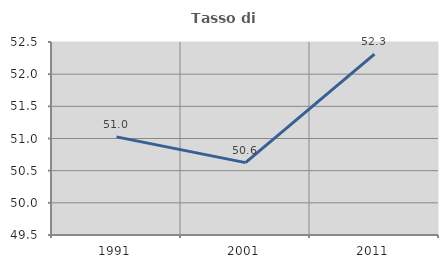
| Category | Tasso di occupazione   |
|---|---|
| 1991.0 | 51.025 |
| 2001.0 | 50.625 |
| 2011.0 | 52.312 |